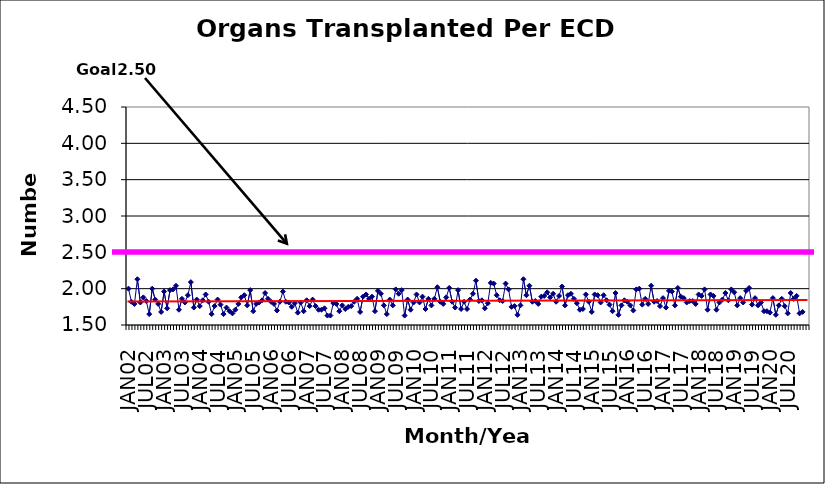
| Category | Series 0 |
|---|---|
| JAN02 | 2 |
| FEB02 | 1.82 |
| MAR02 | 1.79 |
| APR02 | 2.13 |
| MAY02 | 1.81 |
| JUN02 | 1.88 |
| JUL02 | 1.83 |
| AUG02 | 1.65 |
| SEP02 | 2 |
| OCT02 | 1.85 |
| NOV02 | 1.79 |
| DEC02 | 1.68 |
| JAN03 | 1.96 |
| FEB03 | 1.73 |
| MAR03 | 1.98 |
| APR03 | 1.99 |
| MAY03 | 2.04 |
| JUN03 | 1.71 |
| JUL03 | 1.86 |
| AUG03 | 1.81 |
| SEP03 | 1.91 |
| OCT03 | 2.09 |
| NOV03 | 1.74 |
| DEC03 | 1.85 |
| JAN04 | 1.76 |
| FEB04 | 1.84 |
| MAR04 | 1.92 |
| APR04 | 1.82 |
| MAY04 | 1.65 |
| JUN04 | 1.76 |
| JUL04 | 1.85 |
| AUG04 | 1.78 |
| SEP04 | 1.65 |
| OCT04 | 1.74 |
| NOV04 | 1.69 |
| DEC04 | 1.66 |
| JAN05 | 1.71 |
| FEB05 | 1.79 |
| MAR05 | 1.88 |
| APR05 | 1.91 |
| MAY05 | 1.77 |
| JUN05 | 1.98 |
| JUL05 | 1.69 |
| AUG05 | 1.79 |
| SEP05 | 1.81 |
| OCT05 | 1.84 |
| NOV05 | 1.94 |
| DEC05 | 1.86 |
| JAN06 | 1.82 |
| FEB06 | 1.79 |
| MAR06 | 1.7 |
| APR06 | 1.82 |
| MAY06 | 1.96 |
| JUN06 | 1.82 |
| JUL06 | 1.81 |
| AUG06 | 1.75 |
| SEP06 | 1.8 |
| OCT06 | 1.67 |
| NOV06 | 1.81 |
| DEC06 | 1.69 |
| JAN07 | 1.84 |
| FEB07 | 1.76 |
| MAR07 | 1.85 |
| APR07 | 1.76 |
| MAY07 | 1.71 |
| JUN07 | 1.71 |
| JUL07 | 1.73 |
| AUG07 | 1.63 |
| SEP07 | 1.63 |
| OCT07 | 1.8 |
| NOV07 | 1.79 |
| DEC07 | 1.69 |
| JAN08 | 1.77 |
| FEB08 | 1.72 |
| MAR08 | 1.75 |
| APR08 | 1.76 |
| MAY08 | 1.82 |
| JUN08 | 1.86 |
| JUL08 | 1.68 |
| AUG08 | 1.89 |
| SEP08 | 1.92 |
| OCT08 | 1.86 |
| NOV08 | 1.89 |
| DEC08 | 1.69 |
| JAN09 | 1.97 |
| FEB09 | 1.93 |
| MAR09 | 1.77 |
| APR09 | 1.65 |
| MAY09 | 1.85 |
| JUN09 | 1.77 |
| JUL09 | 1.99 |
| AUG09 | 1.93 |
| SEP09 | 1.98 |
| OCT09 | 1.63 |
| NOV09 | 1.85 |
| DEC09 | 1.71 |
| JAN10 | 1.81 |
| FEB10 | 1.92 |
| MAR10 | 1.81 |
| APR10 | 1.89 |
| MAY10 | 1.72 |
| JUN10 | 1.86 |
| JUL10 | 1.77 |
| AUG10 | 1.86 |
| SEP10 | 2.02 |
| OCT10 | 1.82 |
| NOV10 | 1.79 |
| DEC10 | 1.88 |
| JAN11 | 2.01 |
| FEB11 | 1.82 |
| MAR11 | 1.74 |
| APR11 | 1.98 |
| MAY11 | 1.72 |
| JUN11 | 1.82 |
| JUL11 | 1.72 |
| AUG11 | 1.85 |
| SEP11 | 1.93 |
| OCT11 | 2.11 |
| NOV11 | 1.83 |
| DEC11 | 1.84 |
| JAN12 | 1.73 |
| FEB12 | 1.8 |
| MAR12 | 2.08 |
| APR12 | 2.07 |
| MAY12 | 1.91 |
| JUN12 | 1.84 |
| JUL12 | 1.83 |
| AUG12 | 2.07 |
| SEP12 | 1.99 |
| OCT12 | 1.75 |
| NOV12 | 1.76 |
| DEC12 | 1.64 |
| JAN13 | 1.77 |
| FEB13 | 2.13 |
| MAR13 | 1.91 |
| APR13 | 2.04 |
| MAY13 | 1.82 |
| JUN13 | 1.83 |
| JUL13 | 1.79 |
| AUG13 | 1.89 |
| SEP13 | 1.9 |
| OCT13 | 1.95 |
| NOV13 | 1.88 |
| DEC13 | 1.93 |
| JAN14 | 1.82 |
| FEB14 | 1.9 |
| MAR14 | 2.03 |
| APR14 | 1.77 |
| MAY14 | 1.91 |
| JUN14 | 1.93 |
| JUL14 | 1.86 |
| AUG14 | 1.8 |
| SEP14 | 1.71 |
| OCT14 | 1.72 |
| NOV14 | 1.92 |
| DEC14 | 1.82 |
| JAN15 | 1.68 |
| FEB15 | 1.92 |
| MAR15 | 1.91 |
| APR15 | 1.81 |
| MAY15 | 1.91 |
| JUN15 | 1.84 |
| JUL15 | 1.78 |
| AUG15 | 1.69 |
| SEP15 | 1.94 |
| OCT15 | 1.64 |
| NOV15 | 1.77 |
| DEC15 | 1.84 |
| JAN16 | 1.82 |
| FEB16 | 1.77 |
| MAR16 | 1.7 |
| APR16 | 1.99 |
| MAY16 | 2 |
| JUN16 | 1.78 |
| JUL16 | 1.86 |
| AUG16 | 1.79 |
| SEP16 | 2.04 |
| OCT16 | 1.82 |
| NOV16 | 1.83 |
| DEC16 | 1.76 |
| JAN17 | 1.87 |
| FEB17 | 1.74 |
| MAR17 | 1.97 |
| APR17 | 1.96 |
| MAY17 | 1.77 |
| JUN17 | 2.01 |
| JUL17 | 1.89 |
| AUG17 | 1.87 |
| SEP17 | 1.81 |
| OCT17 | 1.83 |
| NOV17 | 1.83 |
| DEC17 | 1.79 |
| JAN18 | 1.92 |
| FEB18 | 1.9 |
| MAR18 | 1.99 |
| APR18 | 1.71 |
| MAY18 | 1.92 |
| JUN18 | 1.9 |
| JUL18 | 1.71 |
| AUG18 | 1.81 |
| SEP18 | 1.85 |
| OCT18 | 1.94 |
| NOV18 | 1.84 |
| DEC18 | 1.99 |
| JAN19 | 1.95 |
| FEB19 | 1.77 |
| MAR19 | 1.87 |
| APR19 | 1.81 |
| MAY19 | 1.97 |
| JUN19 | 2.01 |
| JUL19 | 1.78 |
| AUG19 | 1.87 |
| SEP19 | 1.77 |
| OCT19 | 1.81 |
| NOV19 | 1.69 |
| DEC19 | 1.69 |
| JAN20 | 1.67 |
| FEB20 | 1.87 |
| MAR20 | 1.64 |
| APR20 | 1.77 |
| MAY20 | 1.86 |
| JUN20 | 1.76 |
| JUL20 | 1.66 |
| AUG20 | 1.94 |
| SEP20 | 1.86 |
| OCT20 | 1.9 |
| NOV20 | 1.66 |
| DEC20 | 1.68 |